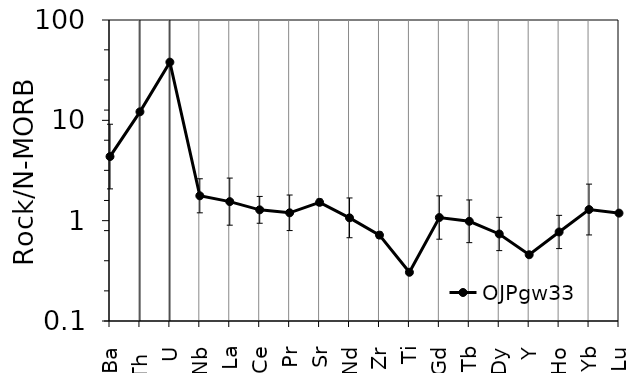
| Category | OJPgw33 |
|---|---|
| Ba | 4.354 |
| Th  | 12.153 |
| U | 38.022 |
| Nb | 1.769 |
| La | 1.548 |
| Ce | 1.282 |
| Pr | 1.198 |
| Sr | 1.523 |
| Nd | 1.067 |
| Zr | 0.718 |
| Ti | 0.306 |
| Gd | 1.075 |
| Tb | 0.986 |
| Dy | 0.737 |
| Y | 0.458 |
| Ho | 0.772 |
| Yb | 1.291 |
| Lu | 1.189 |